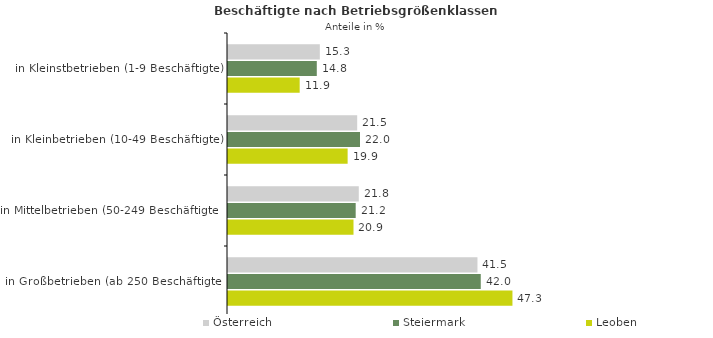
| Category | Österreich | Steiermark | Leoben |
|---|---|---|---|
| in Kleinstbetrieben (1-9 Beschäftigte) | 15.273 | 14.768 | 11.922 |
| in Kleinbetrieben (10-49 Beschäftigte) | 21.487 | 21.955 | 19.896 |
| in Mittelbetrieben (50-249 Beschäftigte) | 21.75 | 21.237 | 20.873 |
| in Großbetrieben (ab 250 Beschäftigte) | 41.489 | 42.04 | 47.31 |